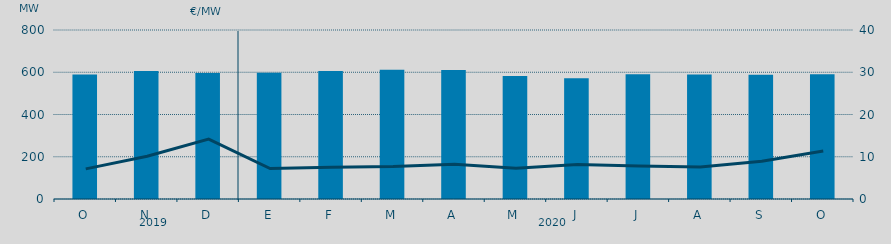
| Category | Energia (MWh) a subir |
|---|---|
| O | 589.349 |
| N | 605.422 |
| D | 596.999 |
| E | 597.488 |
| F | 605.632 |
| M | 611.351 |
| A | 610.483 |
| M | 582.745 |
| J | 571.897 |
| J | 590.058 |
| A | 589.661 |
| S | 587.738 |
| O | 590.796 |